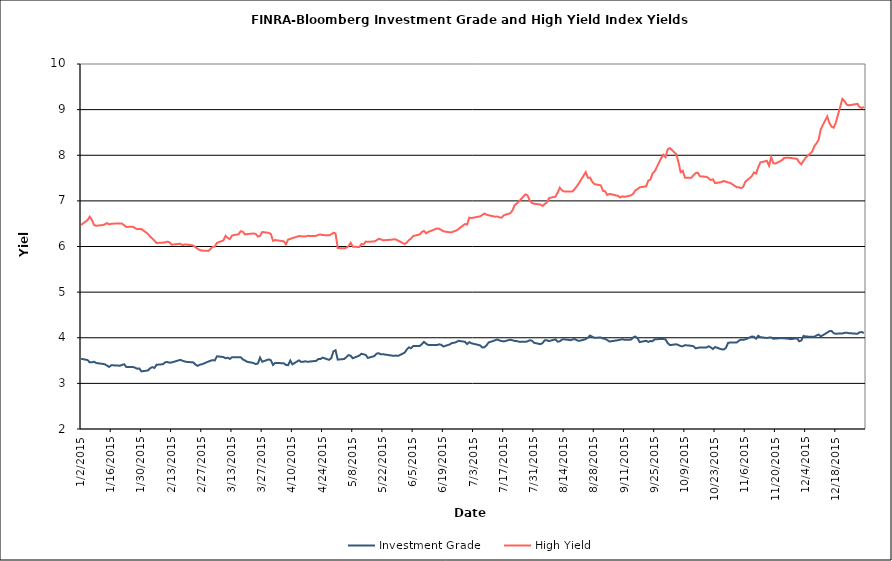
| Category | Investment Grade | High Yield |
|---|---|---|
| 1/2/15 | 3.539 | 6.473 |
| 1/5/15 | 3.512 | 6.579 |
| 1/6/15 | 3.46 | 6.653 |
| 1/7/15 | 3.461 | 6.584 |
| 1/8/15 | 3.475 | 6.473 |
| 1/9/15 | 3.446 | 6.454 |
| 1/12/15 | 3.428 | 6.47 |
| 1/13/15 | 3.418 | 6.483 |
| 1/14/15 | 3.39 | 6.514 |
| 1/15/15 | 3.36 | 6.485 |
| 1/16/15 | 3.398 | 6.499 |
| 1/20/15 | 3.388 | 6.507 |
| 1/21/15 | 3.406 | 6.501 |
| 1/22/15 | 3.418 | 6.465 |
| 1/23/15 | 3.358 | 6.428 |
| 1/26/15 | 3.361 | 6.434 |
| 1/27/15 | 3.345 | 6.403 |
| 1/28/15 | 3.321 | 6.38 |
| 1/29/15 | 3.327 | 6.384 |
| 1/30/15 | 3.263 | 6.383 |
| 2/2/15 | 3.283 | 6.276 |
| 2/3/15 | 3.33 | 6.218 |
| 2/4/15 | 3.356 | 6.175 |
| 2/5/15 | 3.339 | 6.128 |
| 2/6/15 | 3.407 | 6.077 |
| 2/9/15 | 3.421 | 6.086 |
| 2/10/15 | 3.462 | 6.091 |
| 2/11/15 | 3.47 | 6.106 |
| 2/12/15 | 3.453 | 6.094 |
| 2/13/15 | 3.458 | 6.04 |
| 2/17/15 | 3.516 | 6.061 |
| 2/18/15 | 3.496 | 6.032 |
| 2/19/15 | 3.481 | 6.045 |
| 2/20/15 | 3.471 | 6.044 |
| 2/23/15 | 3.46 | 6.021 |
| 2/24/15 | 3.413 | 5.985 |
| 2/25/15 | 3.385 | 5.95 |
| 2/26/15 | 3.409 | 5.923 |
| 2/27/15 | 3.418 | 5.91 |
| 3/2/15 | 3.477 | 5.903 |
| 3/3/15 | 3.496 | 5.943 |
| 3/4/15 | 3.51 | 5.991 |
| 3/5/15 | 3.501 | 6 |
| 3/6/15 | 3.594 | 6.079 |
| 3/9/15 | 3.577 | 6.134 |
| 3/10/15 | 3.55 | 6.235 |
| 3/11/15 | 3.562 | 6.188 |
| 3/12/15 | 3.536 | 6.163 |
| 3/13/15 | 3.575 | 6.241 |
| 3/16/15 | 3.572 | 6.268 |
| 3/17/15 | 3.575 | 6.335 |
| 3/18/15 | 3.525 | 6.323 |
| 3/19/15 | 3.502 | 6.265 |
| 3/20/15 | 3.473 | 6.273 |
| 3/23/15 | 3.447 | 6.285 |
| 3/24/15 | 3.422 | 6.276 |
| 3/25/15 | 3.437 | 6.217 |
| 3/26/15 | 3.564 | 6.235 |
| 3/27/15 | 3.474 | 6.318 |
| 3/30/15 | 3.526 | 6.299 |
| 3/31/15 | 3.507 | 6.274 |
| 4/1/15 | 3.404 | 6.124 |
| 4/2/15 | 3.449 | 6.142 |
| 4/6/15 | 3.44 | 6.113 |
| 4/7/15 | 3.404 | 6.048 |
| 4/8/15 | 3.398 | 6.153 |
| 4/9/15 | 3.501 | 6.166 |
| 4/10/15 | 3.417 | 6.184 |
| 4/13/15 | 3.504 | 6.228 |
| 4/14/15 | 3.471 | 6.226 |
| 4/15/15 | 3.473 | 6.219 |
| 4/16/15 | 3.484 | 6.218 |
| 4/17/15 | 3.473 | 6.234 |
| 4/20/15 | 3.489 | 6.228 |
| 4/21/15 | 3.492 | 6.234 |
| 4/22/15 | 3.533 | 6.256 |
| 4/23/15 | 3.533 | 6.264 |
| 4/24/15 | 3.564 | 6.251 |
| 4/27/15 | 3.515 | 6.246 |
| 4/28/15 | 3.552 | 6.264 |
| 4/29/15 | 3.699 | 6.302 |
| 4/30/15 | 3.726 | 6.285 |
| 5/1/15 | 3.52 | 5.968 |
| 5/4/15 | 3.534 | 5.958 |
| 5/5/15 | 3.574 | 5.972 |
| 5/6/15 | 3.62 | 6.006 |
| 5/7/15 | 3.605 | 6.081 |
| 5/8/15 | 3.55 | 5.995 |
| 5/11/15 | 3.609 | 5.99 |
| 5/12/15 | 3.65 | 6.054 |
| 5/13/15 | 3.637 | 6.048 |
| 5/14/15 | 3.622 | 6.108 |
| 5/15/15 | 3.557 | 6.102 |
| 5/18/15 | 3.6 | 6.112 |
| 5/19/15 | 3.651 | 6.136 |
| 5/20/15 | 3.661 | 6.167 |
| 5/21/15 | 3.638 | 6.158 |
| 5/22/15 | 3.64 | 6.136 |
| 5/26/15 | 3.609 | 6.149 |
| 5/27/15 | 3.605 | 6.158 |
| 5/28/15 | 3.609 | 6.154 |
| 5/29/15 | 3.603 | 6.129 |
| 6/1/15 | 3.671 | 6.055 |
| 6/2/15 | 3.74 | 6.084 |
| 6/3/15 | 3.79 | 6.139 |
| 6/4/15 | 3.77 | 6.173 |
| 6/5/15 | 3.818 | 6.229 |
| 6/8/15 | 3.819 | 6.264 |
| 6/9/15 | 3.86 | 6.317 |
| 6/10/15 | 3.91 | 6.341 |
| 6/11/15 | 3.87 | 6.29 |
| 6/12/15 | 3.84 | 6.32 |
| 6/15/15 | 3.842 | 6.375 |
| 6/16/15 | 3.839 | 6.396 |
| 6/17/15 | 3.856 | 6.39 |
| 6/18/15 | 3.846 | 6.365 |
| 6/19/15 | 3.809 | 6.333 |
| 6/22/15 | 3.854 | 6.31 |
| 6/23/15 | 3.886 | 6.314 |
| 6/24/15 | 3.89 | 6.335 |
| 6/25/15 | 3.906 | 6.351 |
| 6/26/15 | 3.933 | 6.383 |
| 6/29/15 | 3.911 | 6.493 |
| 6/30/15 | 3.862 | 6.48 |
| 7/1/15 | 3.903 | 6.633 |
| 7/2/15 | 3.879 | 6.623 |
| 7/6/15 | 3.834 | 6.661 |
| 7/7/15 | 3.788 | 6.691 |
| 7/8/15 | 3.79 | 6.722 |
| 7/9/15 | 3.833 | 6.699 |
| 7/10/15 | 3.898 | 6.684 |
| 7/13/15 | 3.945 | 6.654 |
| 7/14/15 | 3.962 | 6.658 |
| 7/15/15 | 3.941 | 6.639 |
| 7/16/15 | 3.928 | 6.631 |
| 7/17/15 | 3.92 | 6.684 |
| 7/20/15 | 3.957 | 6.728 |
| 7/21/15 | 3.946 | 6.789 |
| 7/22/15 | 3.931 | 6.902 |
| 7/23/15 | 3.927 | 6.942 |
| 7/24/15 | 3.914 | 6.987 |
| 7/27/15 | 3.912 | 7.142 |
| 7/28/15 | 3.92 | 7.122 |
| 7/29/15 | 3.945 | 7.014 |
| 7/30/15 | 3.937 | 6.955 |
| 7/31/15 | 3.891 | 6.938 |
| 8/3/15 | 3.859 | 6.92 |
| 8/4/15 | 3.885 | 6.888 |
| 8/5/15 | 3.946 | 6.932 |
| 8/6/15 | 3.943 | 6.967 |
| 8/7/15 | 3.927 | 7.062 |
| 8/10/15 | 3.964 | 7.093 |
| 8/11/15 | 3.914 | 7.18 |
| 8/12/15 | 3.922 | 7.288 |
| 8/13/15 | 3.961 | 7.23 |
| 8/14/15 | 3.966 | 7.205 |
| 8/17/15 | 3.946 | 7.205 |
| 8/18/15 | 3.964 | 7.21 |
| 8/19/15 | 3.97 | 7.268 |
| 8/20/15 | 3.942 | 7.329 |
| 8/21/15 | 3.932 | 7.397 |
| 8/24/15 | 3.969 | 7.631 |
| 8/25/15 | 4.004 | 7.506 |
| 8/26/15 | 4.048 | 7.509 |
| 8/27/15 | 4.024 | 7.42 |
| 8/28/15 | 3.999 | 7.369 |
| 8/31/15 | 4.006 | 7.34 |
| 9/1/15 | 3.984 | 7.221 |
| 9/2/15 | 3.974 | 7.211 |
| 9/3/15 | 3.949 | 7.128 |
| 9/4/15 | 3.918 | 7.154 |
| 9/8/15 | 3.947 | 7.11 |
| 9/9/15 | 3.956 | 7.075 |
| 9/10/15 | 3.97 | 7.101 |
| 9/11/15 | 3.954 | 7.087 |
| 9/14/15 | 3.96 | 7.121 |
| 9/15/15 | 4.007 | 7.156 |
| 9/16/15 | 4.028 | 7.23 |
| 9/17/15 | 3.993 | 7.256 |
| 9/18/15 | 3.906 | 7.296 |
| 9/21/15 | 3.934 | 7.32 |
| 9/22/15 | 3.908 | 7.44 |
| 9/23/15 | 3.928 | 7.47 |
| 9/24/15 | 3.924 | 7.602 |
| 9/25/15 | 3.968 | 7.65 |
| 9/28/15 | 3.972 | 7.936 |
| 9/29/15 | 3.972 | 8.01 |
| 9/30/15 | 3.965 | 7.959 |
| 10/1/15 | 3.884 | 8.129 |
| 10/2/15 | 3.839 | 8.158 |
| 10/5/15 | 3.857 | 8.024 |
| 10/6/15 | 3.84 | 7.851 |
| 10/7/15 | 3.818 | 7.629 |
| 10/8/15 | 3.812 | 7.659 |
| 10/9/15 | 3.837 | 7.508 |
| 10/12/15 | 3.824 | 7.508 |
| 10/13/15 | 3.812 | 7.563 |
| 10/14/15 | 3.768 | 7.61 |
| 10/15/15 | 3.779 | 7.616 |
| 10/16/15 | 3.788 | 7.538 |
| 10/19/15 | 3.785 | 7.528 |
| 10/20/15 | 3.814 | 7.497 |
| 10/21/15 | 3.788 | 7.455 |
| 10/22/15 | 3.753 | 7.473 |
| 10/23/15 | 3.796 | 7.388 |
| 10/26/15 | 3.747 | 7.413 |
| 10/27/15 | 3.743 | 7.438 |
| 10/28/15 | 3.777 | 7.418 |
| 10/29/15 | 3.886 | 7.404 |
| 10/30/15 | 3.896 | 7.394 |
| 11/2/15 | 3.894 | 7.301 |
| 11/3/15 | 3.935 | 7.298 |
| 11/4/15 | 3.959 | 7.279 |
| 11/5/15 | 3.956 | 7.305 |
| 11/6/15 | 3.965 | 7.419 |
| 11/9/15 | 4.026 | 7.539 |
| 11/10/15 | 4.023 | 7.622 |
| 11/11/15 | 3.98 | 7.598 |
| 11/12/15 | 4.043 | 7.738 |
| 11/13/15 | 4.012 | 7.843 |
| 11/16/15 | 3.995 | 7.878 |
| 11/17/15 | 4.004 | 7.77 |
| 11/18/15 | 4.007 | 7.96 |
| 11/19/15 | 3.976 | 7.826 |
| 11/20/15 | 3.983 | 7.817 |
| 11/23/15 | 3.992 | 7.892 |
| 11/24/15 | 3.987 | 7.94 |
| 11/25/15 | 3.985 | 7.947 |
| 11/27/15 | 3.969 | 7.941 |
| 11/30/15 | 3.988 | 7.921 |
| 12/1/15 | 3.922 | 7.843 |
| 12/2/15 | 3.941 | 7.803 |
| 12/3/15 | 4.042 | 7.88 |
| 12/4/15 | 4.027 | 7.946 |
| 12/7/15 | 4.02 | 8.079 |
| 12/8/15 | 4.022 | 8.196 |
| 12/9/15 | 4.049 | 8.261 |
| 12/10/15 | 4.07 | 8.336 |
| 12/11/15 | 4.029 | 8.573 |
| 12/14/15 | 4.113 | 8.851 |
| 12/15/15 | 4.144 | 8.708 |
| 12/16/15 | 4.149 | 8.625 |
| 12/17/15 | 4.1 | 8.603 |
| 12/18/15 | 4.089 | 8.721 |
| 12/21/15 | 4.094 | 9.233 |
| 12/22/15 | 4.106 | 9.187 |
| 12/23/15 | 4.112 | 9.11 |
| 12/24/15 | 4.101 | 9.094 |
| 12/28/15 | 4.087 | 9.127 |
| 12/29/15 | 4.12 | 9.054 |
| 12/30/15 | 4.125 | 9.036 |
| 12/31/15 | 4.104 | 9.06 |